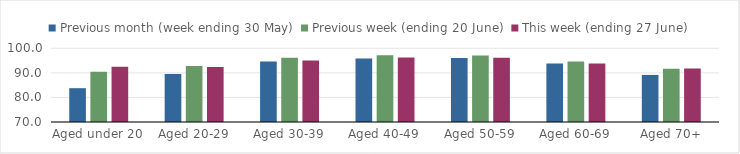
| Category | Previous month (week ending 30 May) | Previous week (ending 20 June) | This week (ending 27 June) |
|---|---|---|---|
| Aged under 20 | 83.759 | 90.451 | 92.444 |
| Aged 20-29 | 89.557 | 92.785 | 92.347 |
| Aged 30-39 | 94.595 | 96.111 | 95.064 |
| Aged 40-49 | 95.866 | 97.146 | 96.232 |
| Aged 50-59 | 96.019 | 97.038 | 96.151 |
| Aged 60-69 | 93.797 | 94.639 | 93.856 |
| Aged 70+ | 89.166 | 91.694 | 91.753 |